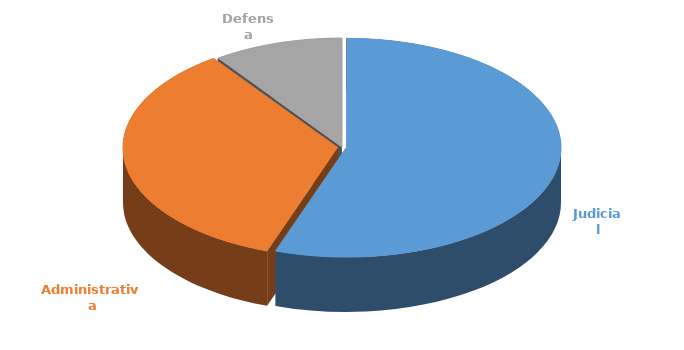
| Category | Cantidad |
|---|---|
| Judicial | 389 |
| Administrativa | 245 |
| Defensa | 69 |